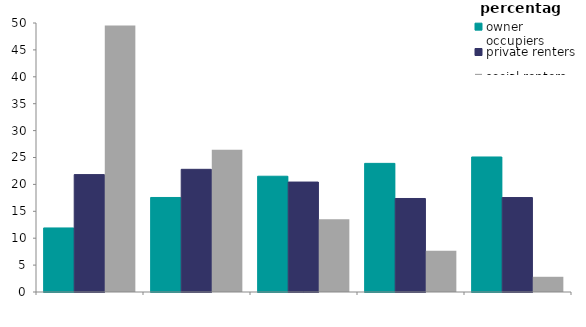
| Category | owner occupiers | private renters | social renters |
|---|---|---|---|
| first quintile 
(lowest incomes) | 11.906 | 21.823 | 49.525 |
| second quintile | 17.57 | 22.803 | 26.458 |
| third quintile | 21.518 | 20.437 | 13.544 |
| fourth quintile | 23.91 | 17.38 | 7.644 |
| fifth quintile 
(highest incomes) | 25.096 | 17.557 | 2.829 |